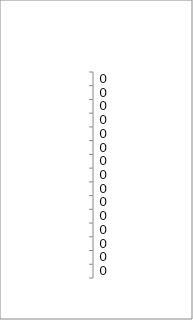
| Category | NB Pieds |
|---|---|
| 0 | 0 |
| 1 | 0 |
| 2 | 0 |
| 3 | 0 |
| 4 | 0 |
| 5 | 0 |
| 6 | 0 |
| 7 | 0 |
| 8 | 0 |
| 9 | 0 |
| 10 | 0 |
| 11 | 0 |
| 12 | 0 |
| 13 | 0 |
| 14 | 0 |